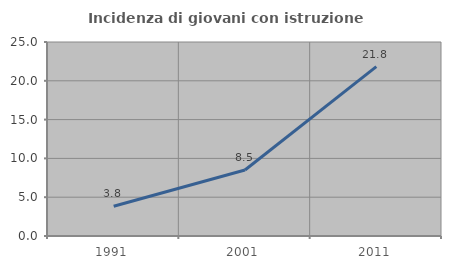
| Category | Incidenza di giovani con istruzione universitaria |
|---|---|
| 1991.0 | 3.834 |
| 2001.0 | 8.506 |
| 2011.0 | 21.834 |